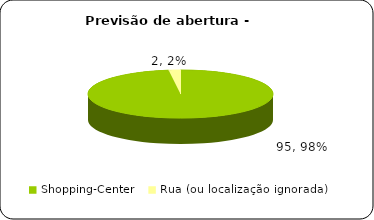
| Category | Series 0 |
|---|---|
| Shopping-Center | 95 |
| Rua (ou localização ignorada) | 2 |